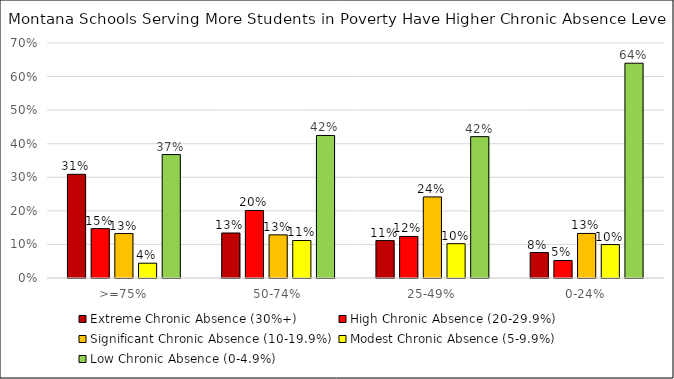
| Category | Extreme Chronic Absence (30%+) | High Chronic Absence (20-29.9%) | Significant Chronic Absence (10-19.9%) | Modest Chronic Absence (5-9.9%) | Low Chronic Absence (0-4.9%) |
|---|---|---|---|---|---|
| >=75% | 0.309 | 0.147 | 0.132 | 0.044 | 0.368 |
| 50-74% | 0.134 | 0.201 | 0.128 | 0.112 | 0.425 |
| 25-49% | 0.111 | 0.124 | 0.241 | 0.102 | 0.421 |
| 0-24% | 0.076 | 0.052 | 0.133 | 0.1 | 0.64 |